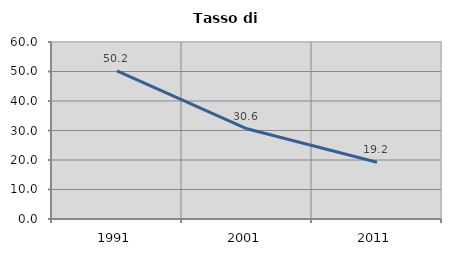
| Category | Tasso di disoccupazione   |
|---|---|
| 1991.0 | 50.211 |
| 2001.0 | 30.588 |
| 2011.0 | 19.212 |